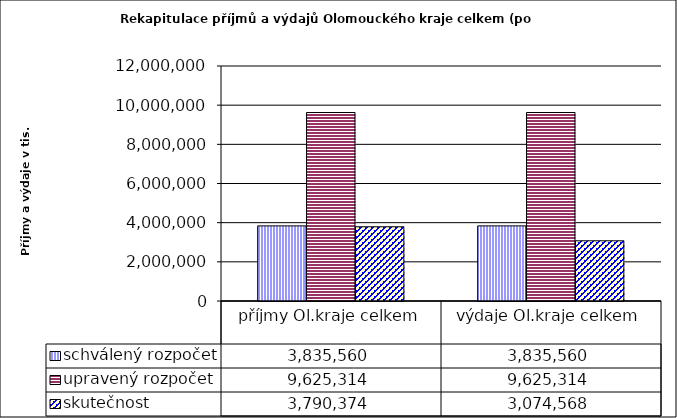
| Category | schválený rozpočet | upravený rozpočet | skutečnost |
|---|---|---|---|
| příjmy Ol.kraje celkem | 3835560 | 9625314 | 3790374 |
| výdaje Ol.kraje celkem | 3835560 | 9625314 | 3074568 |